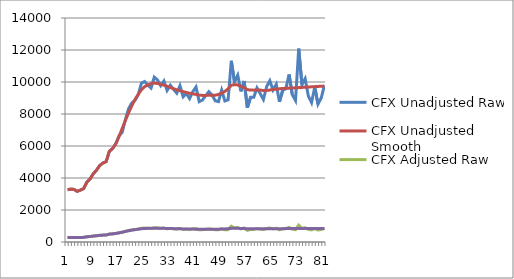
| Category | CFX Unadjusted Raw | CFX Unadjusted Smooth | CFX Adjusted Raw | CFX Adjusted Smooth |
|---|---|---|---|---|
| 0 | 3267.686 | 3267.686 | 284.192 | 284.384 |
| 1 | 3305.802 | 3305.802 | 287.507 | 287.702 |
| 2 | 3286.162 | 3286.162 | 285.798 | 285.992 |
| 3 | 3165.42 | 3165.42 | 275.298 | 275.484 |
| 4 | 3244.224 | 3244.224 | 282.151 | 282.342 |
| 5 | 3338.221 | 3338.221 | 290.326 | 290.523 |
| 6 | 3744.528 | 3744.528 | 325.663 | 325.884 |
| 7 | 3943.962 | 3943.962 | 343.008 | 343.24 |
| 8 | 4262.825 | 4262.825 | 370.739 | 370.99 |
| 9 | 4490.08 | 4490.08 | 390.504 | 390.768 |
| 10 | 4777.254 | 4777.254 | 415.479 | 415.761 |
| 11 | 4935.88 | 4935.88 | 429.275 | 429.566 |
| 12 | 5020.001 | 5020.002 | 436.591 | 436.887 |
| 13 | 5663.557 | 5663.557 | 492.561 | 492.895 |
| 14 | 5839.753 | 5839.753 | 507.885 | 508.229 |
| 15 | 6129.893 | 6129.893 | 533.119 | 533.48 |
| 16 | 6633.905 | 6580.326 | 576.953 | 572.681 |
| 17 | 6857.352 | 7093.456 | 596.386 | 617.338 |
| 18 | 7651.6 | 7593.77 | 665.462 | 660.88 |
| 19 | 8333.611 | 8077.317 | 724.777 | 702.963 |
| 20 | 8687.18 | 8520.464 | 755.527 | 741.53 |
| 21 | 8852.676 | 8906.777 | 769.92 | 775.15 |
| 22 | 9207.116 | 9233.072 | 800.746 | 803.547 |
| 23 | 9925.09 | 9514.662 | 863.188 | 828.054 |
| 24 | 10029.34 | 9707.552 | 872.255 | 844.841 |
| 25 | 9805.268 | 9817.392 | 852.767 | 854.4 |
| 26 | 9622.007 | 9895.889 | 836.829 | 861.232 |
| 27 | 10304.27 | 9934.327 | 896.165 | 864.577 |
| 28 | 10129.81 | 9907.468 | 880.993 | 862.24 |
| 29 | 9768.648 | 9858.084 | 849.582 | 857.942 |
| 30 | 10061.27 | 9803.413 | 875.032 | 853.184 |
| 31 | 9471.429 | 9733.292 | 823.733 | 847.081 |
| 32 | 9799.337 | 9659.506 | 852.251 | 840.66 |
| 33 | 9542.109 | 9583.371 | 829.88 | 834.034 |
| 34 | 9302.795 | 9513.331 | 809.067 | 827.938 |
| 35 | 9773.858 | 9457.141 | 850.035 | 823.048 |
| 36 | 9076.803 | 9398.693 | 789.412 | 817.961 |
| 37 | 9284.205 | 9345.207 | 807.45 | 813.306 |
| 38 | 8965.854 | 9296.195 | 779.763 | 809.041 |
| 39 | 9396.536 | 9261.98 | 817.22 | 806.063 |
| 40 | 9688.358 | 9224.312 | 842.599 | 802.785 |
| 41 | 8772.54 | 9181.285 | 762.95 | 799.04 |
| 42 | 8871.423 | 9163.557 | 771.55 | 797.498 |
| 43 | 9141.07 | 9162.366 | 795.002 | 797.394 |
| 44 | 9395.195 | 9172.903 | 817.103 | 798.311 |
| 45 | 9183.186 | 9172.097 | 798.664 | 798.241 |
| 46 | 8825.19 | 9174.048 | 767.529 | 798.411 |
| 47 | 8772.131 | 9222.087 | 762.915 | 802.591 |
| 48 | 9488.051 | 9308.573 | 825.179 | 810.118 |
| 49 | 8815.07 | 9415.174 | 766.649 | 819.396 |
| 50 | 8884.228 | 9572.158 | 772.664 | 833.058 |
| 51 | 11325.69 | 9797.927 | 984.999 | 852.706 |
| 52 | 10005.05 | 9838.724 | 870.142 | 856.257 |
| 53 | 10425.03 | 9815.057 | 906.668 | 854.197 |
| 54 | 9411.812 | 9729.603 | 818.548 | 846.76 |
| 55 | 10062.04 | 9645.635 | 875.099 | 839.452 |
| 56 | 8393.296 | 9522.937 | 729.967 | 828.774 |
| 57 | 9045.593 | 9495.276 | 786.698 | 826.367 |
| 58 | 9045.236 | 9491.292 | 786.667 | 826.02 |
| 59 | 9628.739 | 9500.448 | 837.414 | 826.817 |
| 60 | 9276.248 | 9496.091 | 806.758 | 826.438 |
| 61 | 8907.295 | 9467.754 | 774.67 | 823.972 |
| 62 | 9710.214 | 9472.728 | 844.5 | 824.405 |
| 63 | 10076.71 | 9496.66 | 876.374 | 826.487 |
| 64 | 9498.298 | 9529.244 | 826.07 | 829.323 |
| 65 | 9853.165 | 9552.235 | 856.933 | 831.324 |
| 66 | 8763.941 | 9577.586 | 762.203 | 833.53 |
| 67 | 9470.371 | 9597.152 | 823.641 | 835.233 |
| 68 | 9578.933 | 9606.04 | 833.083 | 836.007 |
| 69 | 10469.92 | 9614.528 | 910.572 | 836.745 |
| 70 | 9209.703 | 9624.415 | 800.971 | 837.606 |
| 71 | 8844.489 | 9636.737 | 769.208 | 838.678 |
| 72 | 12088.81 | 9649.06 | 1051.367 | 839.751 |
| 73 | 9828.107 | 9661.383 | 854.753 | 840.823 |
| 74 | 10207.92 | 9673.705 | 887.786 | 841.895 |
| 75 | 9122.043 | 9686.028 | 793.347 | 842.968 |
| 76 | 8713.072 | 9698.351 | 757.778 | 844.04 |
| 77 | 9679.535 | 9710.673 | 841.832 | 845.113 |
| 78 | 8618.004 | 9722.996 | 749.51 | 846.185 |
| 79 | 8991.085 | 9735.319 | 781.957 | 847.258 |
| 80 | 9779.175 | 9747.641 | 850.498 | 848.33 |